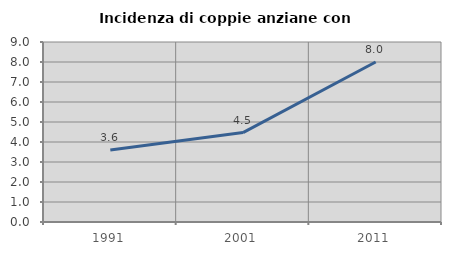
| Category | Incidenza di coppie anziane con figli |
|---|---|
| 1991.0 | 3.604 |
| 2001.0 | 4.472 |
| 2011.0 | 8 |